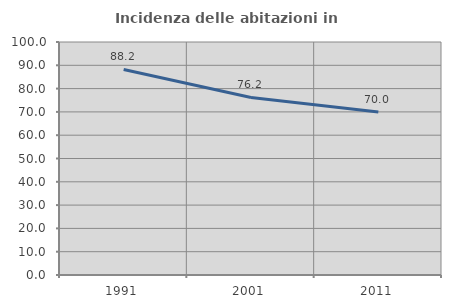
| Category | Incidenza delle abitazioni in proprietà  |
|---|---|
| 1991.0 | 88.235 |
| 2001.0 | 76.19 |
| 2011.0 | 70 |